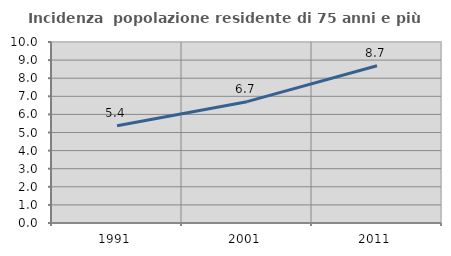
| Category | Incidenza  popolazione residente di 75 anni e più |
|---|---|
| 1991.0 | 5.37 |
| 2001.0 | 6.703 |
| 2011.0 | 8.687 |